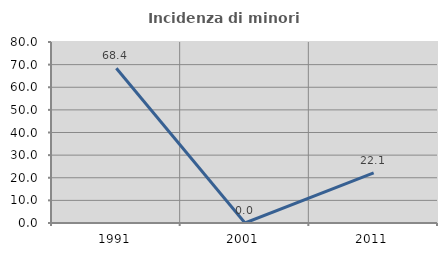
| Category | Incidenza di minori stranieri |
|---|---|
| 1991.0 | 68.421 |
| 2001.0 | 0 |
| 2011.0 | 22.124 |